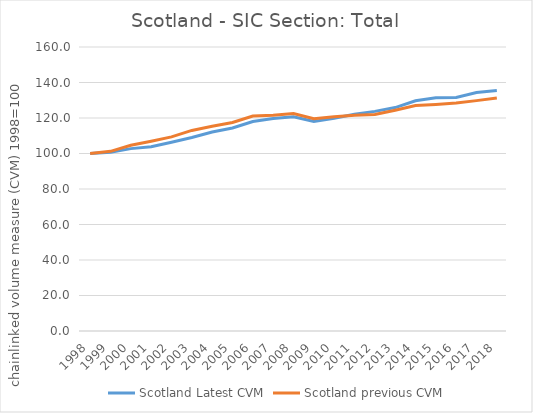
| Category | Scotland |
|---|---|
| 1998.0 | 100 |
| 1999.0 | 101.221 |
| 2000.0 | 104.659 |
| 2001.0 | 106.95 |
| 2002.0 | 109.37 |
| 2003.0 | 112.99 |
| 2004.0 | 115.381 |
| 2005.0 | 117.486 |
| 2006.0 | 121.084 |
| 2007.0 | 121.617 |
| 2008.0 | 122.491 |
| 2009.0 | 119.545 |
| 2010.0 | 120.685 |
| 2011.0 | 121.576 |
| 2012.0 | 121.929 |
| 2013.0 | 124.413 |
| 2014.0 | 126.999 |
| 2015.0 | 127.64 |
| 2016.0 | 128.487 |
| 2017.0 | 129.792 |
| 2018.0 | 131.231 |